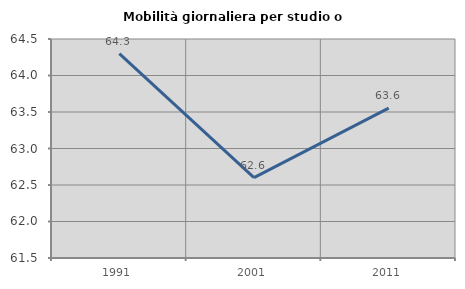
| Category | Mobilità giornaliera per studio o lavoro |
|---|---|
| 1991.0 | 64.301 |
| 2001.0 | 62.602 |
| 2011.0 | 63.553 |